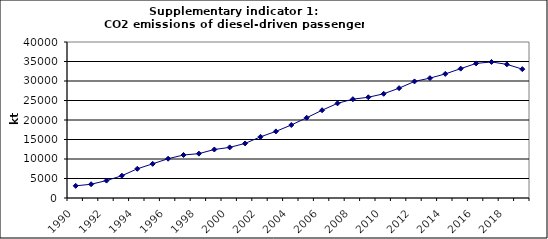
| Category | CO2 emissions of diesel-driven passenger cars, kt |
|---|---|
| 1990 | 3117.792 |
| 1991 | 3527.314 |
| 1992 | 4465.12 |
| 1993 | 5714.454 |
| 1994 | 7487.279 |
| 1995 | 8762.614 |
| 1996 | 10073.812 |
| 1997 | 11029.405 |
| 1998 | 11374.063 |
| 1999 | 12436.863 |
| 2000 | 12979.526 |
| 2001 | 13994.098 |
| 2002 | 15682.677 |
| 2003 | 17077.342 |
| 2004 | 18720.116 |
| 2005 | 20580.232 |
| 2006 | 22506.105 |
| 2007 | 24274.682 |
| 2008 | 25336.694 |
| 2009 | 25831.247 |
| 2010 | 26722.736 |
| 2011 | 28165.88 |
| 2012 | 29889.97 |
| 2013 | 30735.14 |
| 2014 | 31818.48 |
| 2015 | 33171.183 |
| 2016 | 34503.511 |
| 2017 | 34885.844 |
| 2018 | 34270.09 |
| 2019 | 33041.601 |